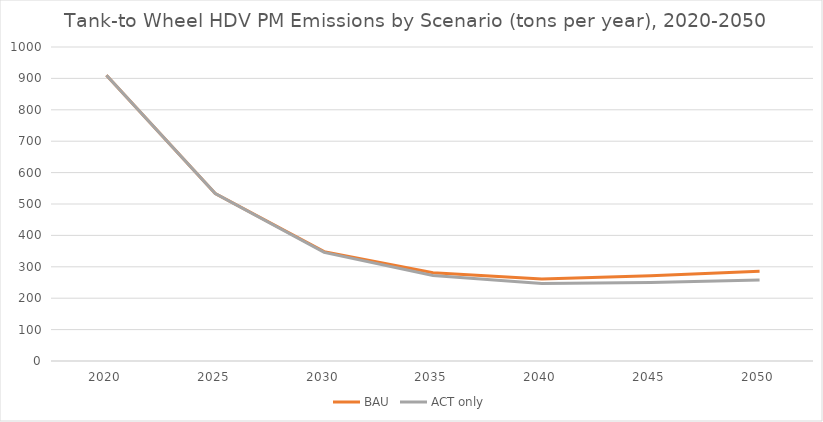
| Category | BAU | ACT only |
|---|---|---|
| 2020.0 | 909.933 | 909.933 |
| 2025.0 | 533.433 | 533.433 |
| 2030.0 | 348.385 | 345.982 |
| 2035.0 | 281.1 | 272.035 |
| 2040.0 | 261.168 | 246.917 |
| 2045.0 | 271.361 | 250.131 |
| 2050.0 | 285.84 | 258.331 |